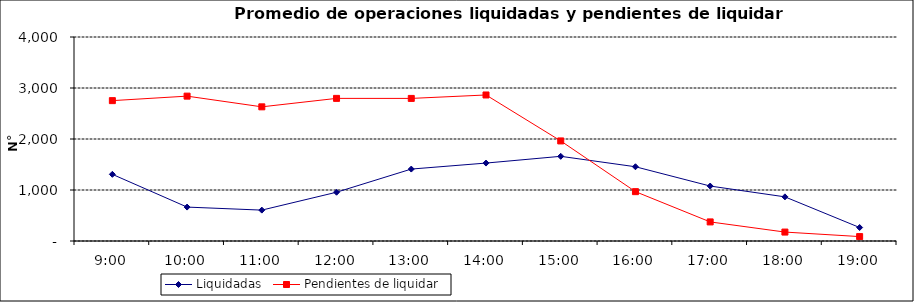
| Category | Liquidadas | Pendientes de liquidar |
|---|---|---|
| 0.375 | 1307 | 2752.35 |
| 0.4166666666666667 | 664.95 | 2840.4 |
| 0.4583333333333333 | 605.4 | 2630.65 |
| 0.5 | 956.25 | 2796.4 |
| 0.5416666666666666 | 1410.25 | 2795.95 |
| 0.5833333333333334 | 1528.05 | 2863.3 |
| 0.625 | 1660.4 | 1962.05 |
| 0.6666666666666666 | 1455.7 | 967.7 |
| 0.7083333333333334 | 1077.4 | 374.3 |
| 0.75 | 865.55 | 175.1 |
| 0.7916666666666666 | 264.25 | 86.5 |